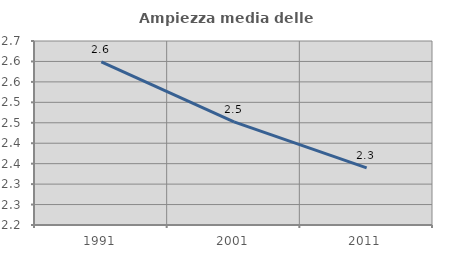
| Category | Ampiezza media delle famiglie |
|---|---|
| 1991.0 | 2.599 |
| 2001.0 | 2.452 |
| 2011.0 | 2.34 |